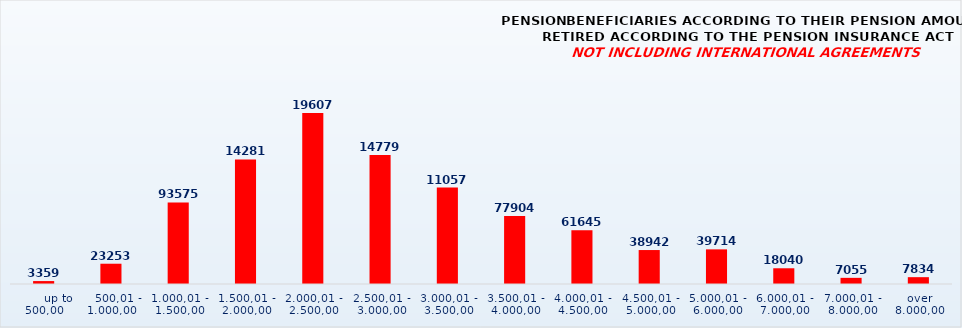
| Category | PENSION BENEFICIARIES ACCORDING TO TYPES AND AMOUNTS OF PENSION, RETIRED ACCORDING TO THE PENSION INSURANCE ACT
NOT INCLUDING INTERNATIONAL AGREEMENTS |
|---|---|
|       up to 500,00 | 3359 |
|    500,01 - 1.000,00 | 23253 |
| 1.000,01 - 1.500,00 | 93575 |
| 1.500,01 - 2.000,00 | 142811 |
| 2.000,01 - 2.500,00 | 196079 |
| 2.500,01 - 3.000,00 | 147795 |
| 3.000,01 - 3.500,00 | 110577 |
| 3.500,01 - 4.000,00 | 77904 |
| 4.000,01 - 4.500,00 | 61645 |
| 4.500,01 - 5.000,00 | 38942 |
| 5.000,01 - 6.000,00 | 39714 |
| 6.000,01 - 7.000,00 | 18040 |
| 7.000,01 - 8.000,00 | 7055 |
|  over  8.000,00 | 7834 |